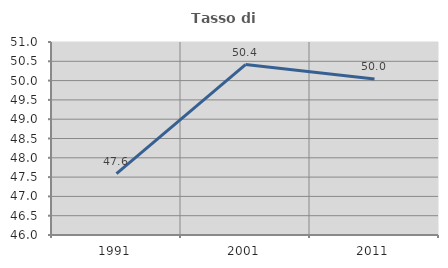
| Category | Tasso di occupazione   |
|---|---|
| 1991.0 | 47.588 |
| 2001.0 | 50.415 |
| 2011.0 | 50.041 |